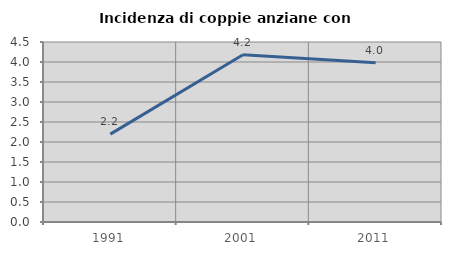
| Category | Incidenza di coppie anziane con figli |
|---|---|
| 1991.0 | 2.198 |
| 2001.0 | 4.18 |
| 2011.0 | 3.982 |